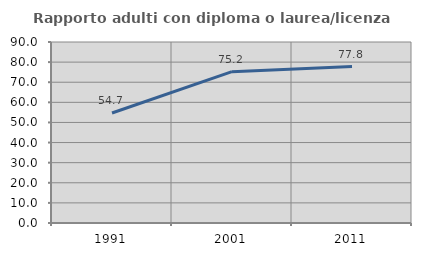
| Category | Rapporto adulti con diploma o laurea/licenza media  |
|---|---|
| 1991.0 | 54.71 |
| 2001.0 | 75.248 |
| 2011.0 | 77.811 |